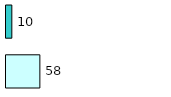
| Category | Series 0 | Series 1 |
|---|---|---|
| 0 | 58 | 10 |